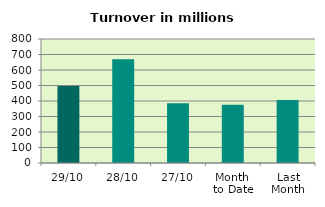
| Category | Series 0 |
|---|---|
| 29/10 | 496.618 |
| 28/10 | 670.052 |
| 27/10 | 386.138 |
| Month 
to Date | 375.959 |
| Last
Month | 405.806 |